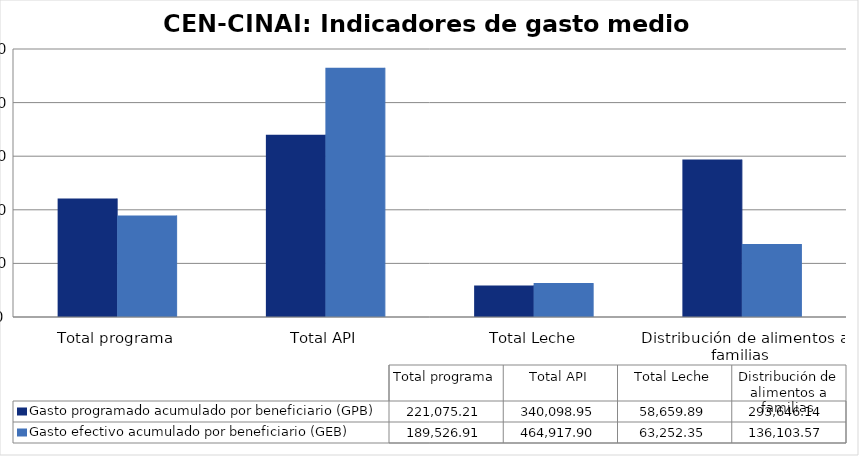
| Category | Gasto programado acumulado por beneficiario (GPB)  | Gasto efectivo acumulado por beneficiario (GEB)  |
|---|---|---|
| Total programa | 221075.214 | 189526.912 |
| Total API | 340098.948 | 464917.899 |
| Total Leche | 58659.889 | 63252.345 |
| Distribución de alimentos a familias  | 293646.143 | 136103.568 |